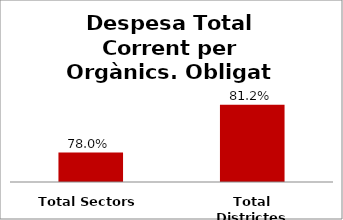
| Category | Series 0 |
|---|---|
| Total Sectors | 0.78 |
| Total Districtes | 0.812 |